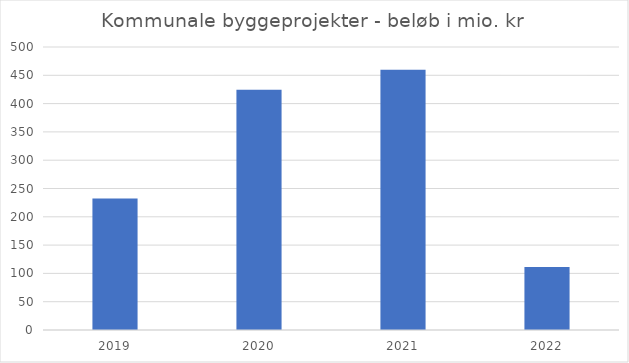
| Category | Beløb |
|---|---|
| 2019.0 | 232.3 |
| 2020.0 | 424.6 |
| 2021.0 | 459.7 |
| 2022.0 | 111.1 |